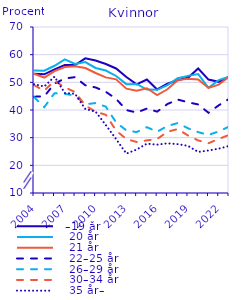
| Category |   –19 år |    20 år |    21 år |    22–25 år |    26–29 år |    30–34 år |    35 år– |
|---|---|---|---|---|---|---|---|
| 2004.0 | 53.113 | 54.308 | 53.093 | 44.811 | 44.682 | 48.989 | 49.333 |
| 2005.0 | 52.896 | 54.231 | 51.738 | 44.924 | 41.029 | 46.986 | 48.504 |
| 2006.0 | 54.66 | 55.993 | 54.063 | 49.559 | 46.079 | 50.564 | 52.049 |
| 2007.0 | 56.231 | 58.282 | 55.522 | 51.379 | 45.85 | 48.188 | 46.142 |
| 2008.0 | 56.263 | 56.659 | 55.802 | 51.877 | 45.196 | 46.493 | 45.845 |
| 2009.0 | 58.671 | 57.335 | 55.155 | 48.933 | 42.018 | 41.6 | 40.362 |
| 2010.0 | 57.882 | 55.202 | 53.368 | 48.152 | 42.522 | 39.405 | 39.409 |
| 2011.0 | 56.62 | 54.272 | 51.792 | 46.569 | 41.209 | 38.258 | 34.546 |
| 2012.0 | 55.007 | 52.298 | 51.067 | 44.022 | 35.493 | 32.578 | 29.47 |
| 2013.0 | 51.925 | 49.345 | 47.703 | 39.974 | 32.637 | 29.498 | 24.237 |
| 2014.0 | 49.276 | 49.427 | 46.948 | 39.078 | 32.018 | 28.445 | 25.701 |
| 2015.0 | 51.033 | 47.406 | 47.876 | 40.525 | 33.788 | 29.021 | 27.832 |
| 2016.0 | 47.446 | 47.304 | 45.408 | 39.407 | 32.144 | 29.503 | 27.475 |
| 2017.0 | 49.492 | 49.001 | 47.482 | 42.147 | 34.218 | 32.134 | 27.946 |
| 2018.0 | 50.768 | 51.478 | 50.795 | 43.779 | 35.271 | 33.11 | 27.662 |
| 2019.0 | 51.628 | 52.332 | 51.32 | 42.798 | 33.396 | 30.796 | 27.034 |
| 2020.0 | 55 | 53 | 51 | 42 | 32 | 29 | 24.836 |
| 2021.0 | 51 | 48 | 48 | 39 | 31 | 28 | 25.372 |
| 2022.0 | 50.184 | 50.796 | 49.181 | 41.687 | 32.242 | 29.52 | 26.032 |
| 2023.0 | 52 | 52 | 52 | 44 | 34 | 31 | 27 |